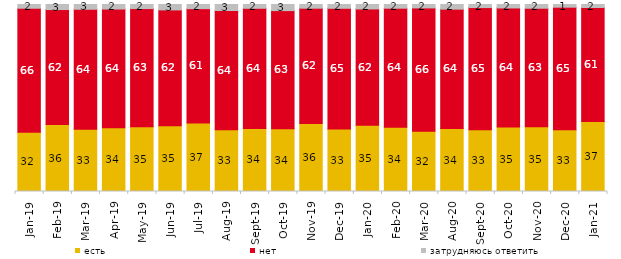
| Category | есть | нет | затрудняюсь ответить |
|---|---|---|---|
| 2019-01-01 | 31.75 | 66.25 | 2 |
| 2019-02-01 | 35.8 | 61.5 | 2.7 |
| 2019-03-01 | 33.317 | 64.147 | 2.536 |
| 2019-04-01 | 34.059 | 63.515 | 2.426 |
| 2019-05-01 | 34.621 | 63.2 | 2.179 |
| 2019-06-01 | 35.162 | 61.945 | 2.893 |
| 2019-07-01 | 36.634 | 61.139 | 2.228 |
| 2019-08-01 | 33.067 | 63.736 | 3.197 |
| 2019-09-01 | 33.713 | 64.257 | 2.03 |
| 2019-10-01 | 33.564 | 63.168 | 3.267 |
| 2019-11-01 | 36.337 | 61.683 | 1.98 |
| 2019-12-01 | 33.416 | 64.554 | 2.03 |
| 2020-01-01 | 35.446 | 62.178 | 2.376 |
| 2020-02-01 | 34.307 | 63.713 | 1.98 |
| 2020-03-01 | 32.226 | 65.94 | 1.834 |
| 2020-08-01 | 33.664 | 63.853 | 2.483 |
| 2020-09-01 | 33.051 | 65.306 | 1.643 |
| 2020-10-01 | 34.529 | 63.627 | 1.844 |
| 2020-11-01 | 34.6 | 63.4 | 2 |
| 2020-12-01 | 33.069 | 65.493 | 1.438 |
| 2021-01-01 | 37.407 | 61.003 | 1.59 |